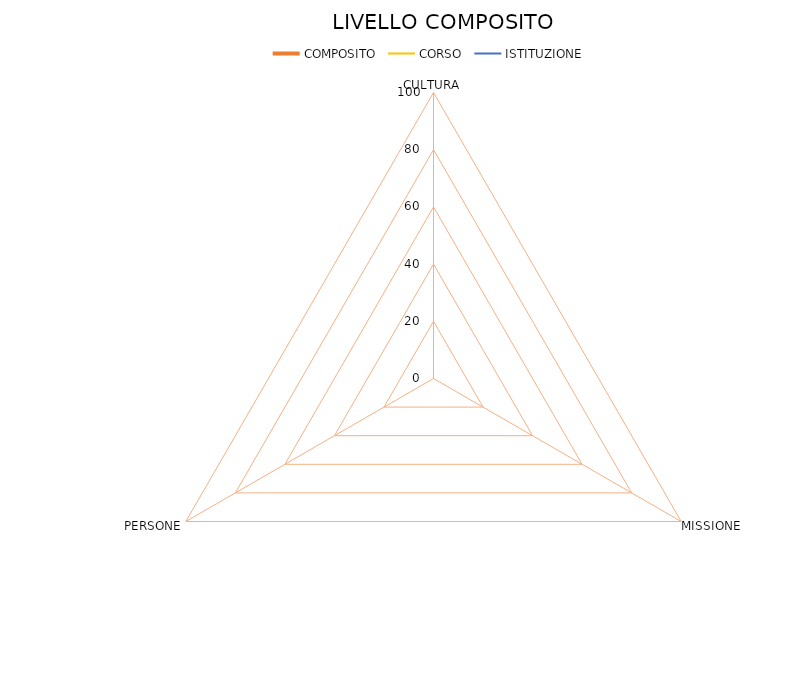
| Category | COMPOSITO | CORSO | ISTITUZIONE |
|---|---|---|---|
| CULTURA | 0 | 0 | 0 |
| MISSIONE | 0 | 0 | 0 |
| PERSONE | 0 | 0 | 0 |